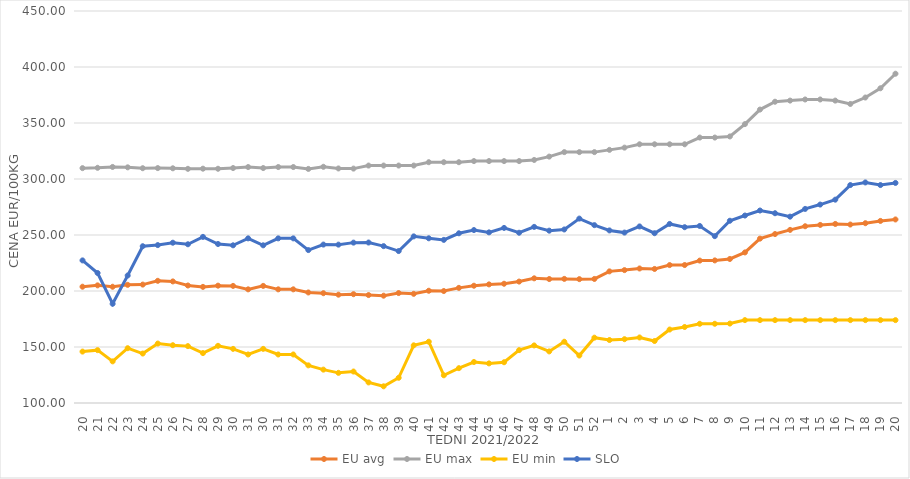
| Category | EU avg | EU max | EU min | SLO |
|---|---|---|---|---|
| 20.0 | 203.834 | 309.69 | 145.911 | 227.32 |
| 21.0 | 205.04 | 309.99 | 147.188 | 216.08 |
| 22.0 | 203.79 | 310.76 | 137.177 | 188.6 |
| 23.0 | 205.51 | 310.41 | 148.928 | 213.84 |
| 24.0 | 205.73 | 309.64 | 144.161 | 239.99 |
| 25.0 | 209.095 | 309.74 | 153.081 | 240.99 |
| 26.0 | 208.551 | 309.55 | 151.599 | 243.11 |
| 27.0 | 204.914 | 309.08 | 150.789 | 241.72 |
| 28.0 | 203.681 | 309.21 | 144.56 | 248.33 |
| 29.0 | 204.773 | 309.15 | 151.052 | 241.96 |
| 30.0 | 204.558 | 309.78 | 148.33 | 240.79 |
| 31.0 | 201.483 | 310.67 | 143.33 | 247 |
| 30.0 | 204.558 | 309.78 | 148.33 | 240.79 |
| 31.0 | 201.483 | 310.67 | 143.33 | 247 |
| 32.0 | 201.483 | 310.67 | 143.33 | 247 |
| 33.0 | 198.691 | 309 | 133.607 | 236.54 |
| 34.0 | 198.027 | 310.9 | 129.797 | 241.45 |
| 35.0 | 196.72 | 309.41 | 126.926 | 241.39 |
| 36.0 | 197.157 | 309.28 | 128.099 | 243.19 |
| 37.0 | 196.375 | 312 | 118.364 | 243.28 |
| 38.0 | 195.821 | 312 | 114.892 | 240.06 |
| 39.0 | 198.179 | 312 | 122.517 | 235.66 |
| 40.0 | 197.482 | 312 | 151.488 | 248.77 |
| 41.0 | 200.22 | 315 | 154.74 | 247.07 |
| 42.0 | 199.965 | 315 | 124.748 | 245.64 |
| 43.0 | 202.804 | 315 | 131.104 | 251.53 |
| 44.0 | 204.713 | 316 | 136.6 | 254.42 |
| 45.0 | 205.906 | 316 | 135.362 | 252.35 |
| 46.0 | 206.476 | 316 | 136.39 | 256.33 |
| 47.0 | 208.415 | 316 | 147.192 | 252.01 |
| 48.0 | 211.314 | 317 | 151.41 | 257.25 |
| 49.0 | 210.677 | 320 | 146.064 | 253.87 |
| 50.0 | 210.823 | 324 | 154.698 | 254.94 |
| 51.0 | 210.59 | 324 | 142.382 | 264.65 |
| 52.0 | 210.763 | 324 | 158.333 | 258.8 |
| 1.0 | 217.519 | 326 | 156.222 | 254.09 |
| 2.0 | 218.654 | 328 | 156.969 | 252.15 |
| 3.0 | 220.098 | 331 | 158.511 | 257.65 |
| 4.0 | 219.685 | 331 | 155.346 | 251.6 |
| 5.0 | 223.143 | 331 | 165.59 | 259.87 |
| 6.0 | 223.178 | 331 | 167.86 | 256.97 |
| 7.0 | 227.145 | 337 | 170.719 | 258.07 |
| 8.0 | 227.312 | 337 | 170.743 | 248.97 |
| 9.0 | 228.588 | 338 | 170.92 | 262.72 |
| 10.0 | 234.434 | 349 | 174 | 267.38 |
| 11.0 | 246.762 | 362 | 174 | 271.86 |
| 12.0 | 250.845 | 369 | 174 | 269.43 |
| 13.0 | 254.568 | 370 | 174 | 266.39 |
| 14.0 | 257.819 | 371 | 174 | 273.3 |
| 15.0 | 259 | 371 | 174 | 277.18 |
| 16.0 | 259.873 | 370 | 174 | 281.55 |
| 17.0 | 259.349 | 367 | 174 | 294.59 |
| 18.0 | 260.528 | 372.758 | 174 | 296.93 |
| 19.0 | 262.562 | 381 | 174 | 294.6 |
| 20.0 | 263.883 | 394 | 174 | 296.48 |